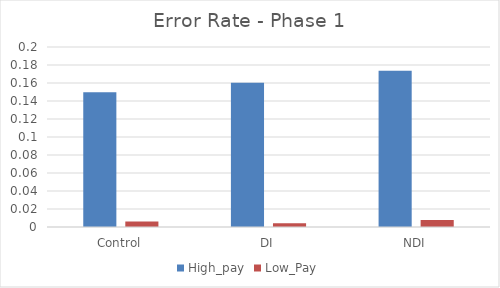
| Category | High_pay | Low_Pay |
|---|---|---|
| Control | 0.15 | 0.006 |
| DI | 0.16 | 0.004 |
| NDI | 0.174 | 0.008 |